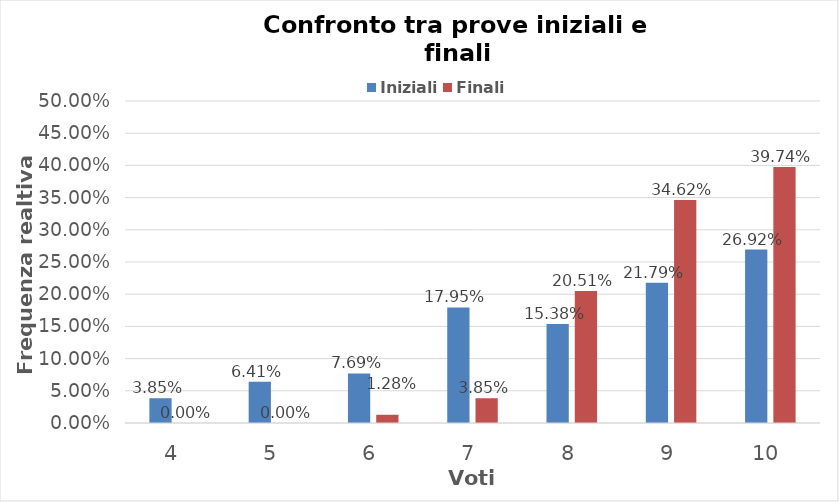
| Category | Iniziali | Finali |
|---|---|---|
| 4.0 | 0.038 | 0 |
| 5.0 | 0.064 | 0 |
| 6.0 | 0.077 | 0.013 |
| 7.0 | 0.179 | 0.038 |
| 8.0 | 0.154 | 0.205 |
| 9.0 | 0.218 | 0.346 |
| 10.0 | 0.269 | 0.397 |